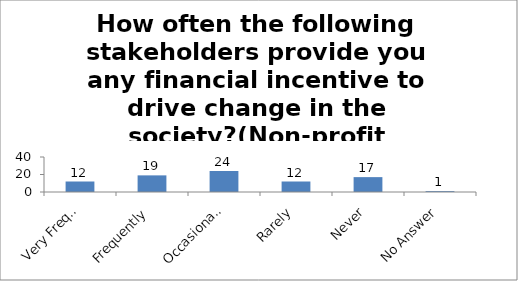
| Category | How often the following stakeholders provide you any financial incentive to drive change in the society?(Non-profit institutions) |
|---|---|
| Very Frequently | 12 |
| Frequently | 19 |
| Occasionally | 24 |
| Rarely | 12 |
| Never | 17 |
| No Answer | 1 |